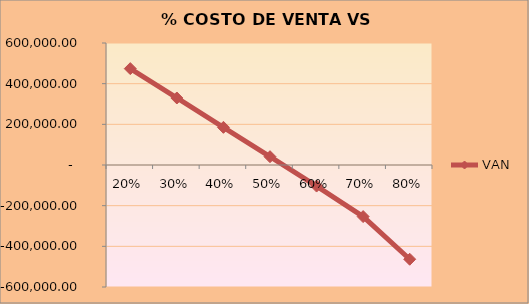
| Category | VAN |
|---|---|
| 0.2 | 473932.677 |
| 0.3 | 329564.738 |
| 0.4 | 185196.799 |
| 0.5 | 40828.86 |
| 0.6 | -103539.079 |
| 0.7 | -253751.999 |
| 0.8 | -463501.03 |